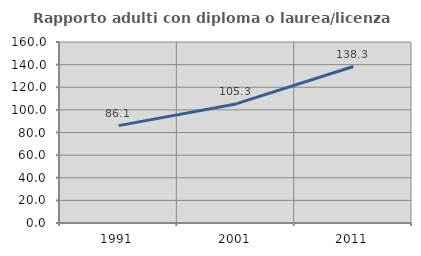
| Category | Rapporto adulti con diploma o laurea/licenza media  |
|---|---|
| 1991.0 | 86.076 |
| 2001.0 | 105.263 |
| 2011.0 | 138.298 |